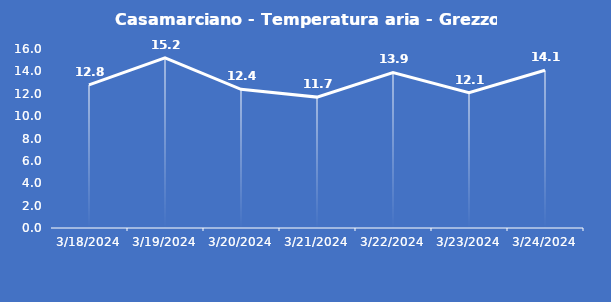
| Category | Casamarciano - Temperatura aria - Grezzo (°C) |
|---|---|
| 3/18/24 | 12.8 |
| 3/19/24 | 15.2 |
| 3/20/24 | 12.4 |
| 3/21/24 | 11.7 |
| 3/22/24 | 13.9 |
| 3/23/24 | 12.1 |
| 3/24/24 | 14.1 |